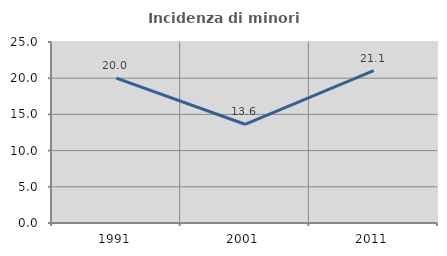
| Category | Incidenza di minori stranieri |
|---|---|
| 1991.0 | 20 |
| 2001.0 | 13.636 |
| 2011.0 | 21.053 |